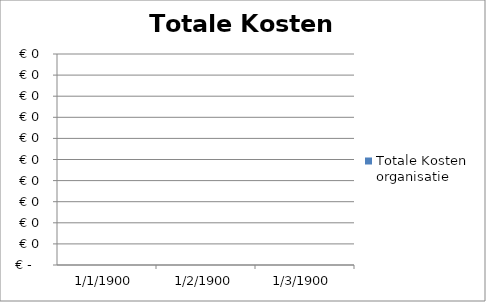
| Category | Totale Kosten organisatie |
|---|---|
| 0 | 0 |
| 1 | 0 |
| 2 | 0 |